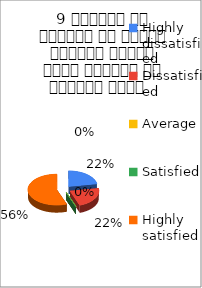
| Category | 9 शिक्षक ने शिक्षण के दौरान आधुनिक तकनीक पावर पॉइन्ट का प्रयोग किया   |
|---|---|
| Highly dissatisfied | 2 |
| Dissatisfied | 2 |
| Average | 0 |
| Satisfied | 0 |
| Highly satisfied | 5 |